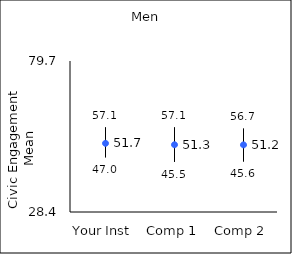
| Category | 25th percentile | 75th percentile | Mean |
|---|---|---|---|
| Your Inst | 47 | 57.1 | 51.73 |
| Comp 1 | 45.5 | 57.1 | 51.25 |
| Comp 2 | 45.6 | 56.7 | 51.21 |